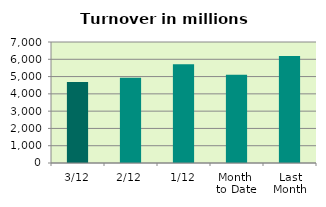
| Category | Series 0 |
|---|---|
| 3/12 | 4681.107 |
| 2/12 | 4931.606 |
| 1/12 | 5719.153 |
| Month 
to Date | 5110.622 |
| Last
Month | 6195.501 |